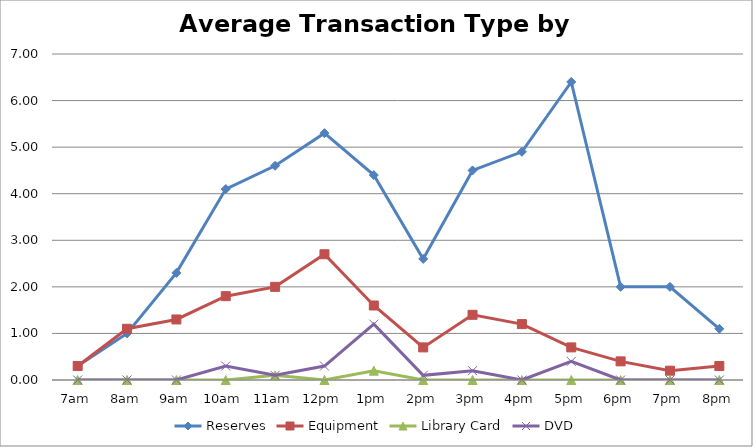
| Category | Reserves | Equipment | Library Card | DVD |
|---|---|---|---|---|
| 7am | 0.3 | 0.3 | 0 | 0 |
| 8am | 1 | 1.1 | 0 | 0 |
| 9am | 2.3 | 1.3 | 0 | 0 |
| 10am | 4.1 | 1.8 | 0 | 0.3 |
| 11am | 4.6 | 2 | 0.1 | 0.1 |
| 12pm | 5.3 | 2.7 | 0 | 0.3 |
| 1pm | 4.4 | 1.6 | 0.2 | 1.2 |
| 2pm | 2.6 | 0.7 | 0 | 0.1 |
| 3pm | 4.5 | 1.4 | 0 | 0.2 |
| 4pm | 4.9 | 1.2 | 0 | 0 |
| 5pm | 6.4 | 0.7 | 0 | 0.4 |
| 6pm | 2 | 0.4 | 0 | 0 |
| 7pm | 2 | 0.2 | 0 | 0 |
| 8pm | 1.1 | 0.3 | 0 | 0 |